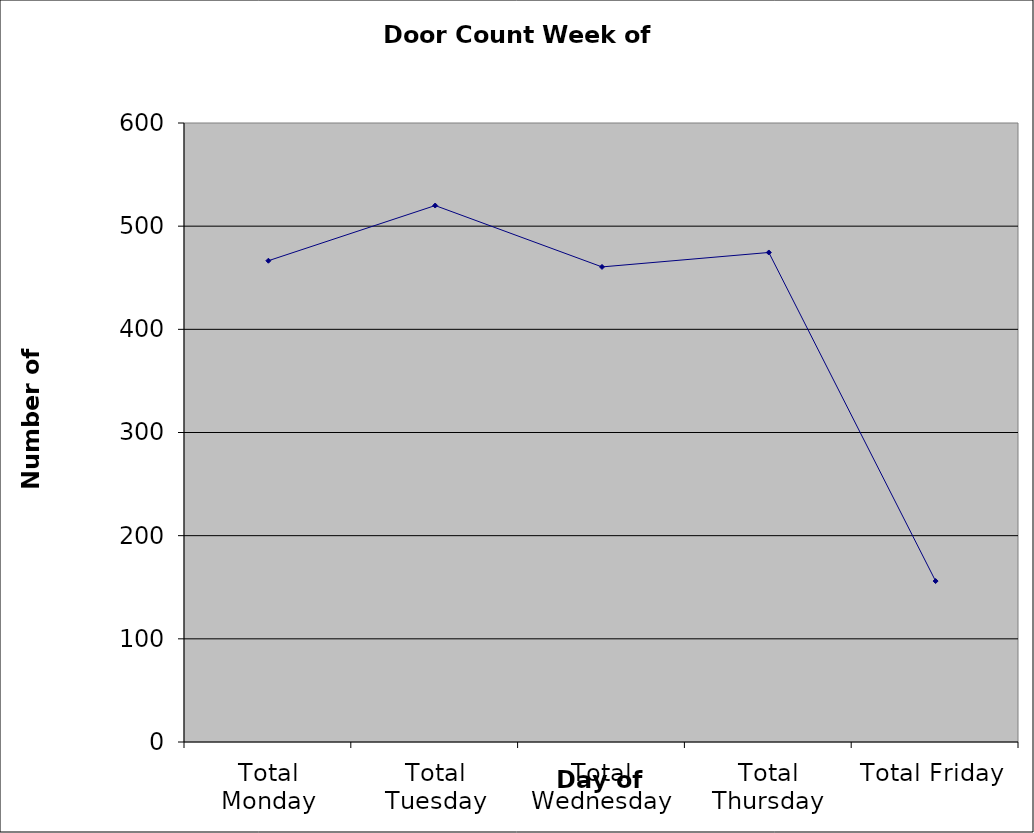
| Category | Series 0 |
|---|---|
| Total Monday | 466.5 |
| Total Tuesday | 520 |
| Total Wednesday | 460.5 |
| Total Thursday | 474.5 |
| Total Friday | 156 |